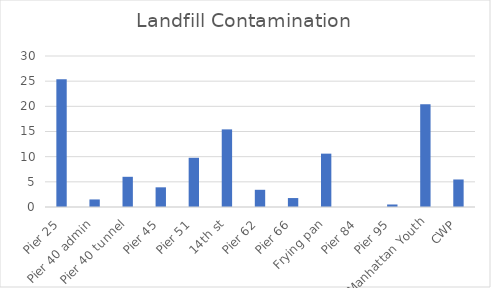
| Category | Landfill Contamination |
|---|---|
| Pier 25 | 25.385 |
| Pier 40 admin | 1.5 |
| Pier 40 tunnel | 6 |
| Pier 45 | 3.909 |
| Pier 51 | 9.778 |
| 14th st | 15.421 |
| Pier 62 | 3.418 |
| Pier 66 | 1.778 |
| Frying pan | 10.6 |
| Pier 84 | 0 |
| Pier 95 | 0.5 |
| Manhattan Youth | 20.4 |
| CWP | 5.467 |